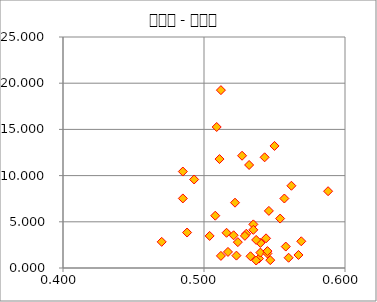
| Category | Series 0 |
|---|---|
| 0.512 | 19.25 |
| 0.485 | 7.53 |
| 0.508 | 5.66 |
| 0.544 | 3.21 |
| 0.524 | 2.8 |
| 0.567 | 1.41 |
| 0.546 | 6.18 |
| 0.527 | 12.15 |
| 0.523 | 1.34 |
| 0.53 | 3.71 |
| 0.554 | 5.35 |
| 0.535 | 4.72 |
| 0.516 | 3.81 |
| 0.485 | 10.44 |
| 0.493 | 9.58 |
| 0.539 | 1.02 |
| 0.557 | 7.52 |
| 0.512 | 1.31 |
| 0.54 | 1.67 |
| 0.522 | 7.07 |
| 0.511 | 11.79 |
| 0.54 | 2.71 |
| 0.55 | 13.21 |
| 0.529 | 3.48 |
| 0.537 | 0.81 |
| 0.558 | 2.32 |
| 0.504 | 3.47 |
| 0.588 | 8.31 |
| 0.545 | 1.57 |
| 0.535 | 4.13 |
| 0.488 | 3.84 |
| 0.545 | 1.83 |
| 0.521 | 3.54 |
| 0.56 | 1.11 |
| 0.562 | 8.9 |
| 0.533 | 1.27 |
| 0.509 | 15.26 |
| 0.532 | 11.15 |
| 0.517 | 1.74 |
| 0.543 | 11.98 |
| 0.537 | 3.04 |
| 0.547 | 0.85 |
| 0.47 | 2.83 |
| 0.569 | 2.89 |